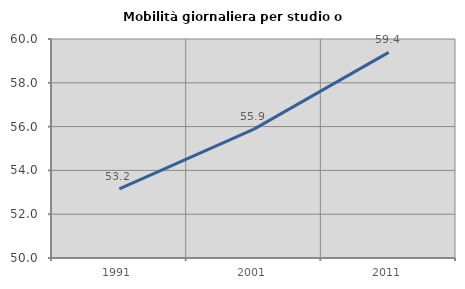
| Category | Mobilità giornaliera per studio o lavoro |
|---|---|
| 1991.0 | 53.155 |
| 2001.0 | 55.882 |
| 2011.0 | 59.389 |